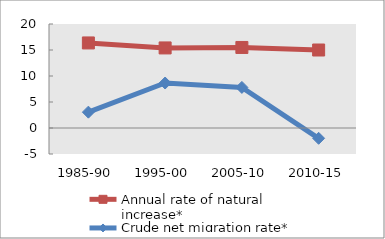
| Category | Annual rate of natural increase* | Crude net migration rate* |
|---|---|---|
| 1985-90 | 16.358 | 3.049 |
| 1995-00 | 15.398 | 8.65 |
| 2005-10 | 15.489 | 7.805 |
| 2010-15 | 14.998 | -1.981 |